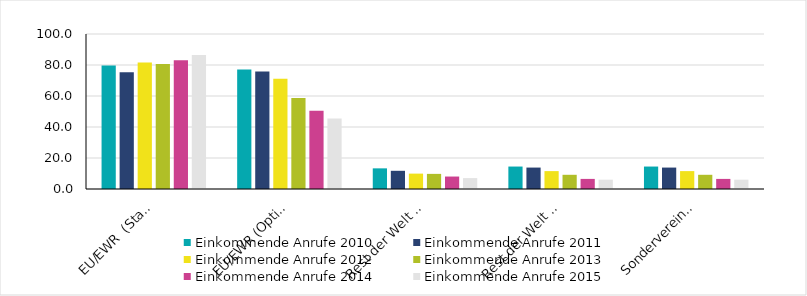
| Category | Einkommende Anrufe 2010 | Einkommende Anrufe 2011 | Einkommende Anrufe 2012 | Einkommende Anrufe 2013 | Einkommende Anrufe 2014 | Einkommende Anrufe 2015 |
|---|---|---|---|---|---|---|
| EU/EWR  (Standard) | 79.691 | 75.401 | 81.659 | 80.601 | 83.089 | 86.415 |
| EU/EWR (Option) | 77.154 | 75.797 | 71.147 | 58.747 | 50.538 | 45.556 |
| Rest der Welt  (Standard) | 13.319 | 11.742 | 9.923 | 9.754 | 8.04 | 7.04 |
| Rest der Welt (Option) | 14.485 | 13.826 | 11.545 | 9.162 | 6.512 | 6.011 |
| Sondervereinbarungen | 14.485 | 13.826 | 11.545 | 9.162 | 6.512 | 6.011 |